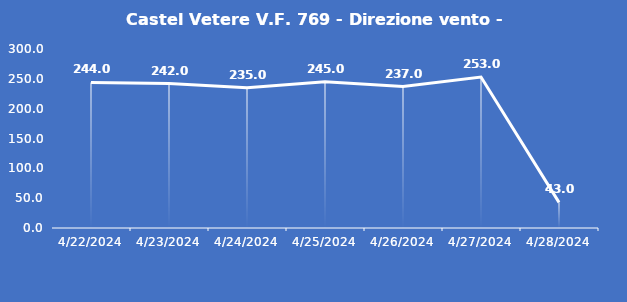
| Category | Castel Vetere V.F. 769 - Direzione vento - Grezzo (°N) |
|---|---|
| 4/22/24 | 244 |
| 4/23/24 | 242 |
| 4/24/24 | 235 |
| 4/25/24 | 245 |
| 4/26/24 | 237 |
| 4/27/24 | 253 |
| 4/28/24 | 43 |